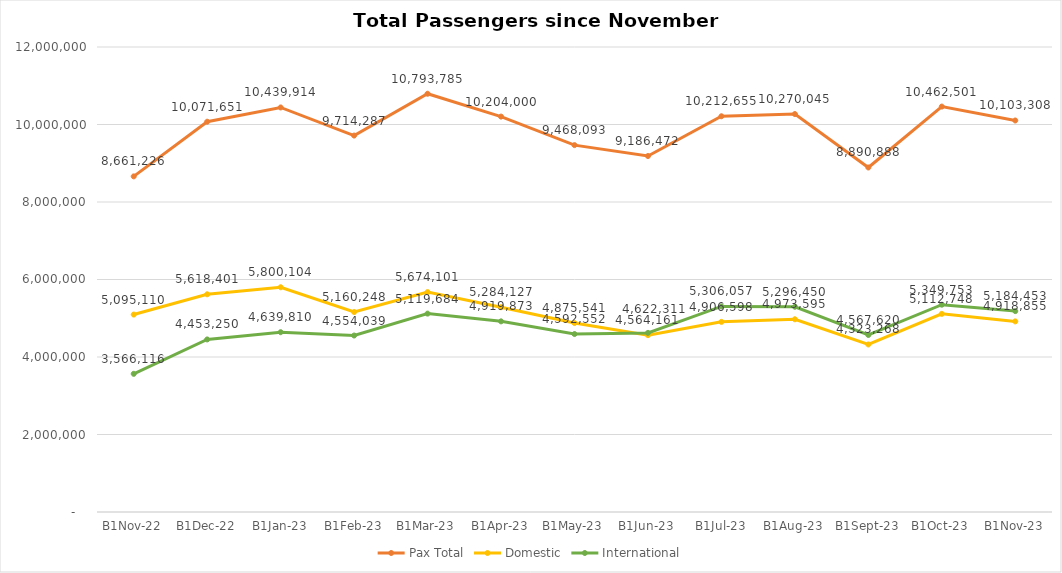
| Category | Pax Total | Domestic | International |
|---|---|---|---|
| 2022-11-01 | 8661226 | 5095110 | 3566116 |
| 2022-12-01 | 10071651 | 5618401 | 4453250 |
| 2023-01-01 | 10439914 | 5800104 | 4639810 |
| 2023-02-01 | 9714287 | 5160248 | 4554039 |
| 2023-03-01 | 10793785 | 5674101 | 5119684 |
| 2023-04-01 | 10204000 | 5284127 | 4919873 |
| 2023-05-01 | 9468093 | 4875541 | 4592552 |
| 2023-06-01 | 9186472 | 4564161 | 4622311 |
| 2023-07-01 | 10212655 | 4906598 | 5306057 |
| 2023-08-01 | 10270045 | 4973595 | 5296450 |
| 2023-09-01 | 8890888 | 4323268 | 4567620 |
| 2023-10-01 | 10462501 | 5112748 | 5349753 |
| 2023-11-01 | 10103308 | 4918855 | 5184453 |